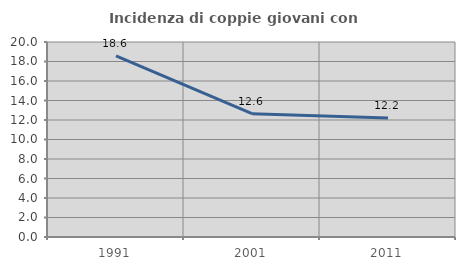
| Category | Incidenza di coppie giovani con figli |
|---|---|
| 1991.0 | 18.584 |
| 2001.0 | 12.644 |
| 2011.0 | 12.203 |